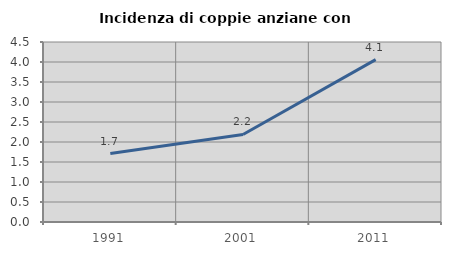
| Category | Incidenza di coppie anziane con figli |
|---|---|
| 1991.0 | 1.711 |
| 2001.0 | 2.189 |
| 2011.0 | 4.059 |